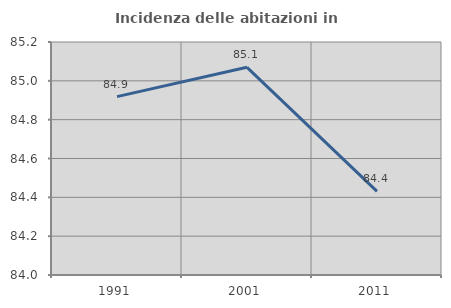
| Category | Incidenza delle abitazioni in proprietà  |
|---|---|
| 1991.0 | 84.919 |
| 2001.0 | 85.07 |
| 2011.0 | 84.431 |